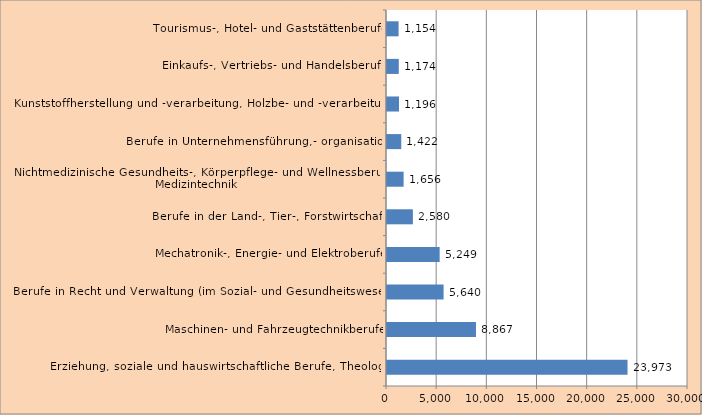
| Category | 2015 |
|---|---|
| Erziehung, soziale und hauswirtschaftliche Berufe, Theologie | 23973 |
| Maschinen- und Fahrzeugtechnikberufe | 8867 |
| Berufe in Recht und Verwaltung (im Sozial- und Gesundheitswesen) | 5640 |
| Mechatronik-, Energie- und Elektroberufe | 5249 |
| Berufe in der Land-, Tier-, Forstwirtschaft  | 2580 |
| Nichtmedizinische Gesundheits-, Körperpflege- und Wellnessberufe, Medizintechnik | 1656 |
| Berufe in Unternehmensführung,- organisation | 1422 |
| Kunststoffherstellung und -verarbeitung, Holzbe- und -verarbeitung | 1196 |
| Einkaufs-, Vertriebs- und Handelsberufe | 1174 |
| Tourismus-, Hotel- und Gaststättenberufe | 1154 |